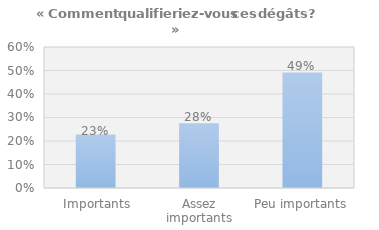
| Category | Series 0 |
|---|---|
|  Importants | 0.228 |
| Assez importants | 0.276 |
| Peu importants | 0.492 |